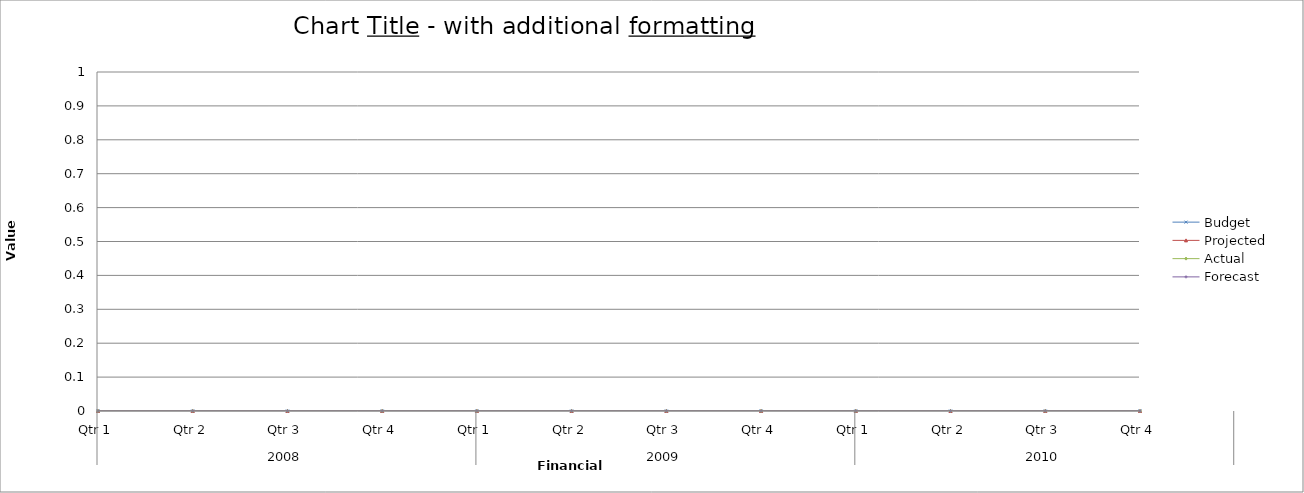
| Category | Budget | Projected | Actual | Forecast |
|---|---|---|---|---|
| 0 | 1260 | 1890 | 3240 | 2310 |
| 1 | 850 | 740 | 1800 | 1450 |
| 2 | 2730 | 3000 | 2760 | 1800 |
| 3 | 1610 | 1350 | 550 | 1140 |
| 4 | 2950 | 2090 | 920 | 2240 |
| 5 | 2450 | 1670 | 500 | 2570 |
| 6 | 2980 | 3070 | 840 | 3070 |
| 7 | 2230 | 2210 | 2860 | 1420 |
| 8 | 1590 | 750 | 920 | 1280 |
| 9 | 2890 | 1300 | 2190 | 2940 |
| 10 | 3450 | 2500 | 2750 | 2600 |
| 11 | 1580 | 2190 | 720 | 3090 |